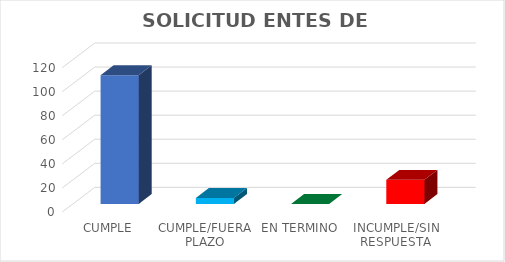
| Category | Series 0 |
|---|---|
| CUMPLE | 107 |
| CUMPLE/FUERA PLAZO | 5 |
| EN TERMINO | 0 |
| INCUMPLE/SIN RESPUESTA | 20 |